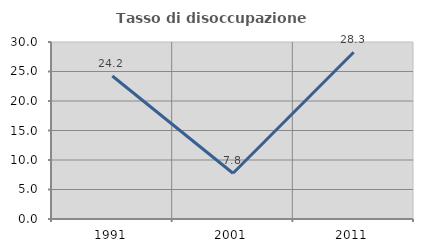
| Category | Tasso di disoccupazione giovanile  |
|---|---|
| 1991.0 | 24.242 |
| 2001.0 | 7.759 |
| 2011.0 | 28.261 |